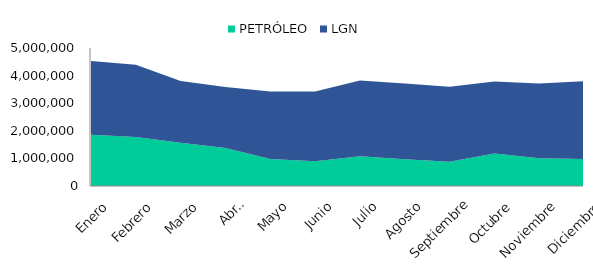
| Category | PETRÓLEO | LGN |
|---|---|---|
| Enero | 1853913 | 2679363 |
| Febrero | 1773624 | 2619534 |
| Marzo | 1566561 | 2242119 |
| Abril | 1374024 | 2214215 |
| Mayo | 977957 | 2448464 |
| Junio | 898212 | 2524087 |
| Julio | 1076668 | 2748149 |
| Agosto | 967626 | 2746804 |
| Septiembre | 874950 | 2725268 |
| Octubre | 1173396 | 2608702 |
| Noviembre | 1004529 | 2712685 |
| Diciembre | 980380 | 2820353 |